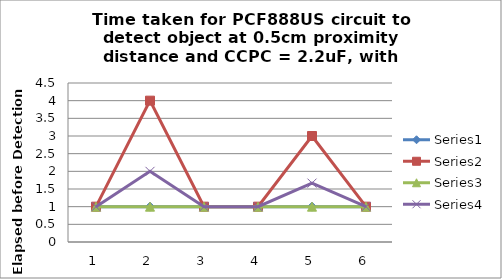
| Category | Series 0 | Series 1 | Series 2 | Series 3 |
|---|---|---|---|---|
| 0 | 1 | 1 | 1 | 1 |
| 1 | 1 | 4 | 1 | 2 |
| 2 | 1 | 1 | 1 | 1 |
| 3 | 1 | 1 | 1 | 1 |
| 4 | 1 | 3 | 1 | 1.667 |
| 5 | 1 | 1 | 1 | 1 |